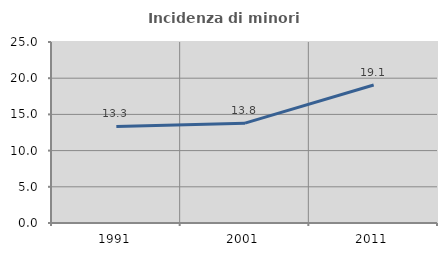
| Category | Incidenza di minori stranieri |
|---|---|
| 1991.0 | 13.333 |
| 2001.0 | 13.793 |
| 2011.0 | 19.068 |